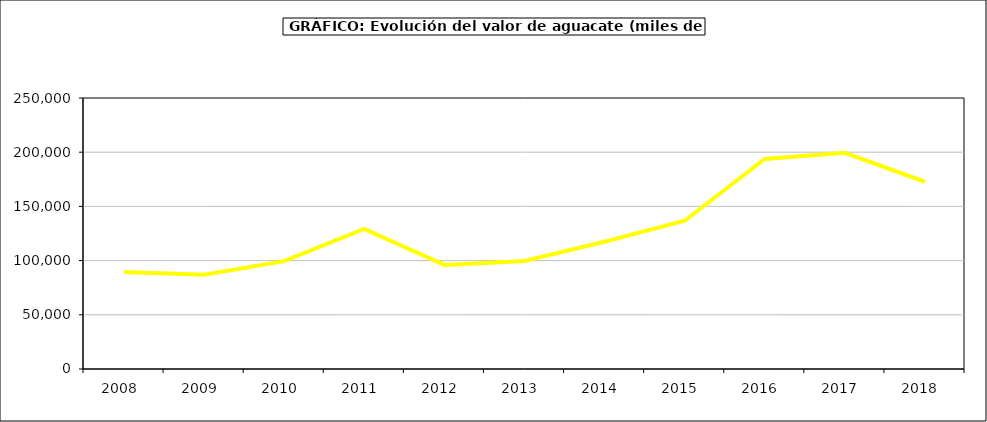
| Category | valor aguacate |
|---|---|
| 2008.0 | 89391.058 |
| 2009.0 | 86892.648 |
| 2010.0 | 99524.152 |
| 2011.0 | 129297.627 |
| 2012.0 | 96001.411 |
| 2013.0 | 99613.86 |
| 2014.0 | 117384.488 |
| 2015.0 | 136798 |
| 2016.0 | 193742 |
| 2017.0 | 199459.243 |
| 2018.0 | 172742.335 |